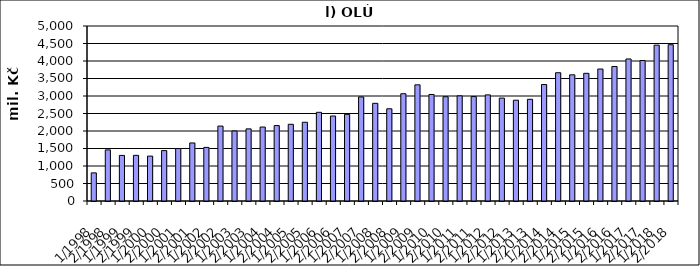
| Category | Series 0 |
|---|---|
| 1/1998 | 803741.058 |
| 2/1998 | 1460404.442 |
| 1/1999 | 1302272.291 |
| 2/1999 | 1304151.709 |
| 1/2000 | 1282995.137 |
| 2/2000 | 1439798.363 |
| 1/2001 | 1499100.677 |
| 2/2001 | 1658392.322 |
| 1/2002 | 1531635 |
| 2/2002 | 2140241 |
| 1/2003 | 2000033 |
| 2/2003 | 2060674.187 |
| 1/2004 | 2113153.033 |
| 2/2004 | 2154600.451 |
| 1/2005 | 2191332 |
| 2/2005 | 2249658.12 |
| 1/2006 | 2534201 |
| 2/2006 | 2428453 |
| 1/2007 | 2476277 |
| 2/2007 | 2973044 |
| 1/2008 | 2790596.364 |
| 2/2008 | 2634424.636 |
| 1/2009 | 3064335.739 |
| 2/2009 | 3318826 |
| 1/2010 | 3043488 |
| 2/2010 | 2979421 |
| 1/2011 | 3004169 |
| 2/2011 | 2983388 |
| 1/2012 | 3031616 |
| 2/2012 | 2940319 |
| 1/2013 | 2879762 |
| 2/2013 | 2905432 |
| 1/2014 | 3327502 |
| 2/2014 | 3664843 |
| 1/2015 | 3604729 |
| 2/2015 | 3648186 |
| 1/2016 | 3770703 |
| 2/2016 | 3843117 |
| 1/2017 | 4058301 |
| 2/2017 | 4013415 |
| 1/2018 | 4453077.112 |
| 2/2018 | 4465262.618 |